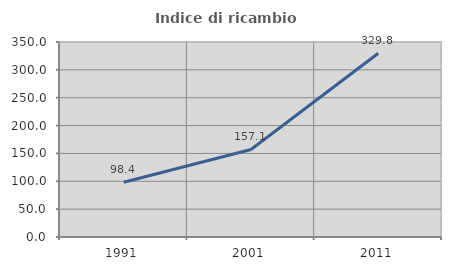
| Category | Indice di ricambio occupazionale  |
|---|---|
| 1991.0 | 98.381 |
| 2001.0 | 157.059 |
| 2011.0 | 329.771 |